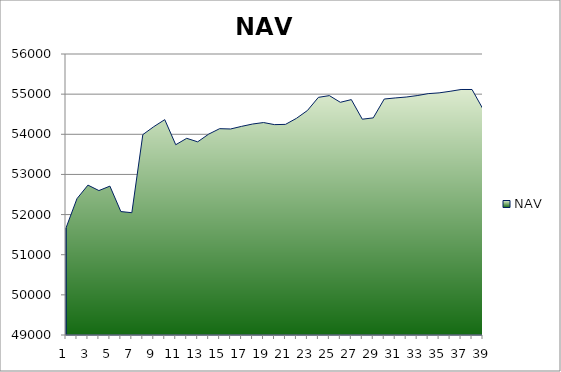
| Category | NAV |
|---|---|
| 0 | 51667 |
| 1 | 52397 |
| 2 | 52733.957 |
| 3 | 52597.875 |
| 4 | 52708.772 |
| 5 | 52075.184 |
| 6 | 52046.775 |
| 7 | 53991.219 |
| 8 | 54189.909 |
| 9 | 54364.909 |
| 10 | 53739.909 |
| 11 | 53899.542 |
| 12 | 53812.294 |
| 13 | 54003.961 |
| 14 | 54140.037 |
| 15 | 54132.37 |
| 16 | 54197.37 |
| 17 | 54255.812 |
| 18 | 54292.622 |
| 19 | 54240.699 |
| 20 | 54246.834 |
| 21 | 54397.391 |
| 22 | 54592.197 |
| 23 | 54920.119 |
| 24 | 54963.245 |
| 25 | 54796.799 |
| 26 | 54863.963 |
| 27 | 54375.975 |
| 28 | 54409.015 |
| 29 | 54878.402 |
| 30 | 54905.151 |
| 31 | 54927.958 |
| 32 | 54964.157 |
| 33 | 55012.385 |
| 34 | 55031.616 |
| 35 | 55070.791 |
| 36 | 55115.989 |
| 37 | 55115.989 |
| 38 | 54627.367 |